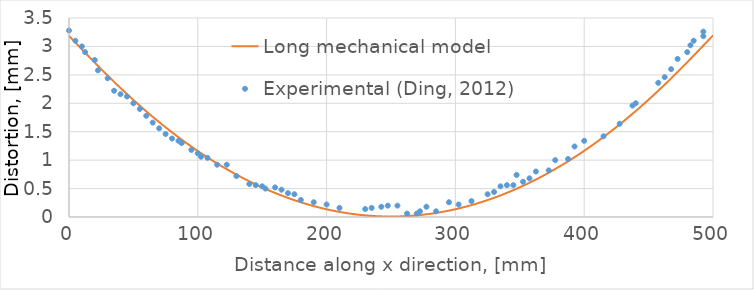
| Category | Long mechanical model |
|---|---|
| 0.0 | 3.186 |
| 8.0 | 2.997 |
| 16.0 | 2.808 |
| 24.0 | 2.624 |
| 32.0 | 2.443 |
| 40.0 | 2.268 |
| 48.0 | 2.1 |
| 56.0 | 1.937 |
| 64.0 | 1.781 |
| 72.0 | 1.632 |
| 80.0 | 1.489 |
| 88.0 | 1.352 |
| 96.0 | 1.223 |
| 104.0 | 1.1 |
| 112.0 | 0.983 |
| 120.0 | 0.873 |
| 128.0 | 0.77 |
| 136.0 | 0.673 |
| 144.0 | 0.583 |
| 152.0 | 0.499 |
| 160.0 | 0.422 |
| 168.0 | 0.352 |
| 176.0 | 0.288 |
| 184.0 | 0.231 |
| 192.0 | 0.18 |
| 200.0 | 0.136 |
| 208.0 | 0.098 |
| 216.0 | 0.067 |
| 224.0 | 0.042 |
| 232.0 | 0.024 |
| 240.0 | 0.013 |
| 248.0 | 0.008 |
| 256.0 | 0.01 |
| 264.0 | 0.018 |
| 272.0 | 0.033 |
| 280.0 | 0.055 |
| 288.0 | 0.083 |
| 296.0 | 0.117 |
| 304.0 | 0.158 |
| 312.0 | 0.206 |
| 320.0 | 0.26 |
| 328.0 | 0.321 |
| 336.0 | 0.389 |
| 344.0 | 0.463 |
| 352.0 | 0.543 |
| 360.0 | 0.63 |
| 368.0 | 0.724 |
| 376.0 | 0.824 |
| 384.0 | 0.931 |
| 392.0 | 1.044 |
| 400.0 | 1.164 |
| 408.0 | 1.291 |
| 416.0 | 1.424 |
| 424.0 | 1.564 |
| 432.0 | 1.71 |
| 440.0 | 1.863 |
| 448.0 | 2.023 |
| 456.0 | 2.189 |
| 464.0 | 2.361 |
| 472.0 | 2.539 |
| 480.0 | 2.722 |
| 488.0 | 2.909 |
| 496.0 | 3.098 |
| 500.0 | 3.193 |